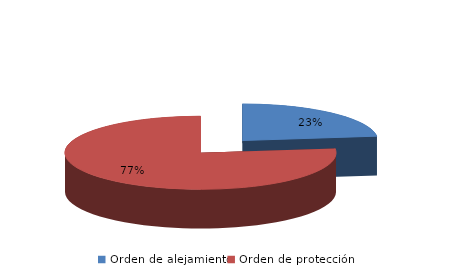
| Category | Series 0 |
|---|---|
| Orden de alejamiento | 97 |
| Orden de protección | 323 |